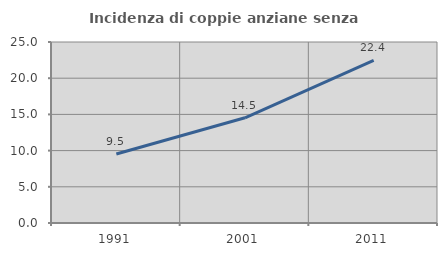
| Category | Incidenza di coppie anziane senza figli  |
|---|---|
| 1991.0 | 9.524 |
| 2001.0 | 14.53 |
| 2011.0 | 22.449 |